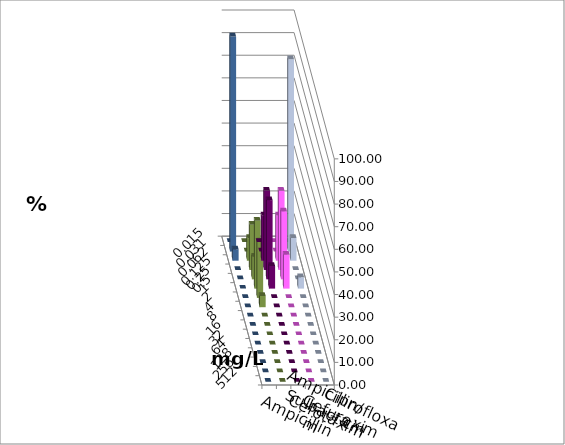
| Category | Ampicillin | Ampicillin/ Sulbactam | Cefotaxim | Cefuroxim | Ciprofloxacin |
|---|---|---|---|---|---|
| 0.015 | 0 | 0 | 0 | 0 | 0 |
| 0.031 | 0 | 0 | 85 | 0 | 95 |
| 0.062 | 20 | 20 | 10 | 10 | 5 |
| 0.125 | 35 | 35 | 0 | 20 | 0 |
| 0.25 | 35 | 30 | 0 | 10 | 0 |
| 0.5 | 10 | 15 | 5 | 30 | 0 |
| 1.0 | 0 | 0 | 0 | 25 | 0 |
| 2.0 | 0 | 0 | 0 | 5 | 0 |
| 4.0 | 0 | 0 | 0 | 0 | 0 |
| 8.0 | 0 | 0 | 0 | 0 | 0 |
| 16.0 | 0 | 0 | 0 | 0 | 0 |
| 32.0 | 0 | 0 | 0 | 0 | 0 |
| 64.0 | 0 | 0 | 0 | 0 | 0 |
| 128.0 | 0 | 0 | 0 | 0 | 0 |
| 256.0 | 0 | 0 | 0 | 0 | 0 |
| 512.0 | 0 | 0 | 0 | 0 | 0 |